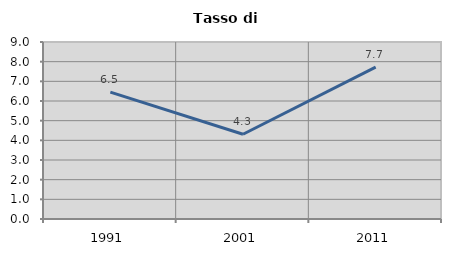
| Category | Tasso di disoccupazione   |
|---|---|
| 1991.0 | 6.453 |
| 2001.0 | 4.309 |
| 2011.0 | 7.72 |